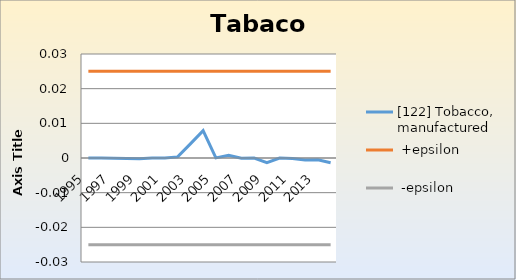
| Category | [122] Tobacco, manufactured |  +epsilon |  -epsilon |
|---|---|---|---|
| 1995.0 | 0 | 0.025 | -0.025 |
| 1996.0 | 0 | 0.025 | -0.025 |
| 1997.0 | 0 | 0.025 | -0.025 |
| 1998.0 | 0 | 0.025 | -0.025 |
| 1999.0 | 0 | 0.025 | -0.025 |
| 2000.0 | 0 | 0.025 | -0.025 |
| 2001.0 | 0 | 0.025 | -0.025 |
| 2002.0 | 0 | 0.025 | -0.025 |
| 2003.0 | 0.004 | 0.025 | -0.025 |
| 2004.0 | 0.008 | 0.025 | -0.025 |
| 2005.0 | 0 | 0.025 | -0.025 |
| 2006.0 | 0.001 | 0.025 | -0.025 |
| 2007.0 | 0 | 0.025 | -0.025 |
| 2008.0 | 0 | 0.025 | -0.025 |
| 2009.0 | -0.001 | 0.025 | -0.025 |
| 2010.0 | 0 | 0.025 | -0.025 |
| 2011.0 | 0 | 0.025 | -0.025 |
| 2012.0 | -0.001 | 0.025 | -0.025 |
| 2013.0 | -0.001 | 0.025 | -0.025 |
| 2014.0 | -0.001 | 0.025 | -0.025 |